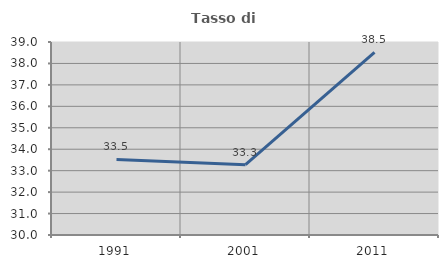
| Category | Tasso di occupazione   |
|---|---|
| 1991.0 | 33.521 |
| 2001.0 | 33.279 |
| 2011.0 | 38.52 |